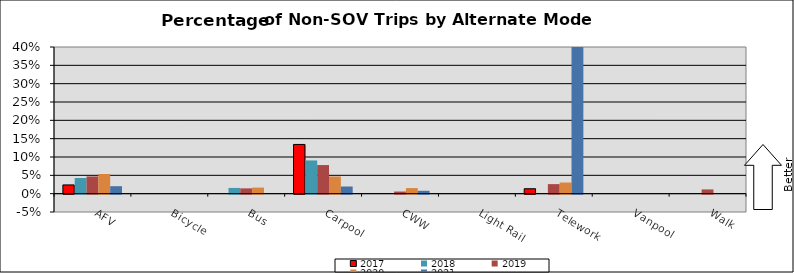
| Category | 2017 | 2018 | 2019 | 2020 | 2021 |
|---|---|---|---|---|---|
| AFV | 0.024 | 0.043 | 0.047 | 0.054 | 0.02 |
| Bicycle | 0 | 0 | 0 | 0 | 0 |
| Bus | 0 | 0.016 | 0.014 | 0.017 | 0 |
| Carpool | 0.134 | 0.091 | 0.078 | 0.047 | 0.02 |
| CWW | 0 | 0 | 0.006 | 0.015 | 0.008 |
| Light Rail | 0 | 0 | 0 | 0 | 0 |
| Telework | 0.013 | 0 | 0.026 | 0.03 | 0.508 |
| Vanpool | 0 | 0 | 0 | 0 | 0 |
| Walk | 0 | 0 | 0.012 | 0 | 0 |